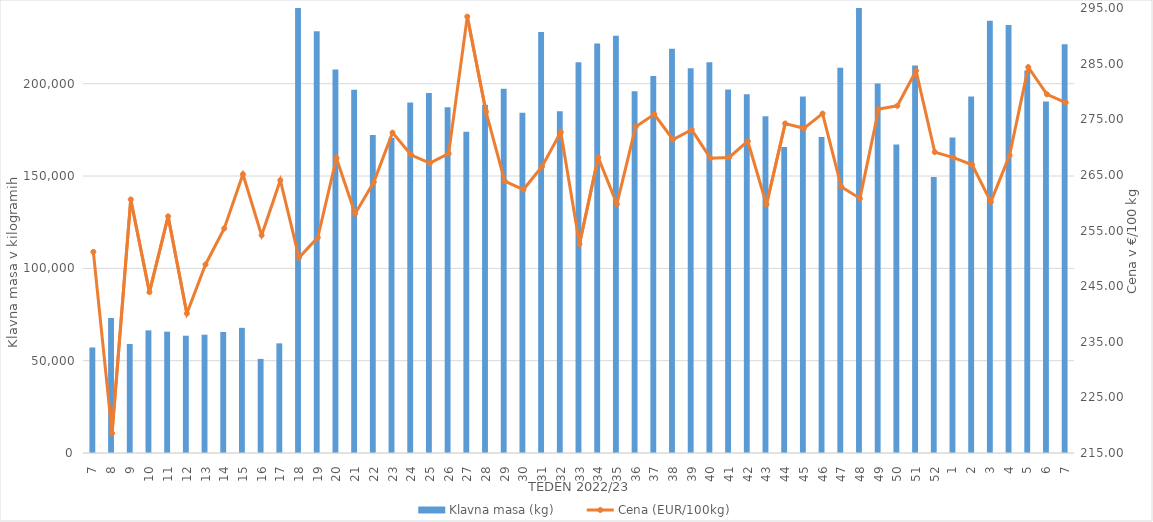
| Category | Klavna masa (kg) |
|---|---|
| 7.0 | 57159 |
| 8.0 | 73139 |
| 9.0 | 59056 |
| 10.0 | 66417 |
| 11.0 | 65723 |
| 12.0 | 63530 |
| 13.0 | 64069 |
| 14.0 | 65564 |
| 15.0 | 67787 |
| 16.0 | 50958 |
| 17.0 | 59387 |
| 18.0 | 241833 |
| 19.0 | 228389 |
| 20.0 | 207661 |
| 21.0 | 196732 |
| 22.0 | 172190 |
| 23.0 | 170751 |
| 24.0 | 189775 |
| 25.0 | 195029 |
| 26.0 | 187239 |
| 27.0 | 173967 |
| 28.0 | 188601 |
| 29.0 | 197293 |
| 30.0 | 184259 |
| 31.0 | 228023 |
| 32.0 | 185079 |
| 33.0 | 211612 |
| 34.0 | 221748 |
| 35.0 | 225927 |
| 36.0 | 195924 |
| 37.0 | 204224 |
| 38.0 | 218966 |
| 39.0 | 208403 |
| 40.0 | 211635 |
| 41.0 | 196841 |
| 42.0 | 194271 |
| 43.0 | 182399 |
| 44.0 | 165696 |
| 45.0 | 193022 |
| 46.0 | 171172 |
| 47.0 | 208597 |
| 48.0 | 253151 |
| 49.0 | 200117 |
| 50.0 | 167119 |
| 51.0 | 209797 |
| 52.0 | 149439 |
| 1.0 | 170843 |
| 2.0 | 193093 |
| 3.0 | 234042 |
| 4.0 | 231737 |
| 5.0 | 207136 |
| 6.0 | 190311 |
| 7.0 | 221366 |